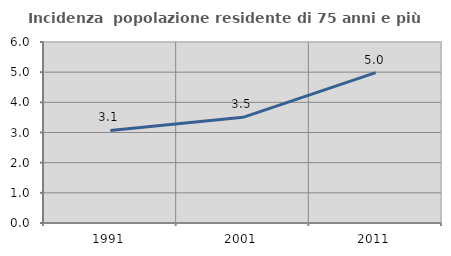
| Category | Incidenza  popolazione residente di 75 anni e più |
|---|---|
| 1991.0 | 3.069 |
| 2001.0 | 3.503 |
| 2011.0 | 4.986 |